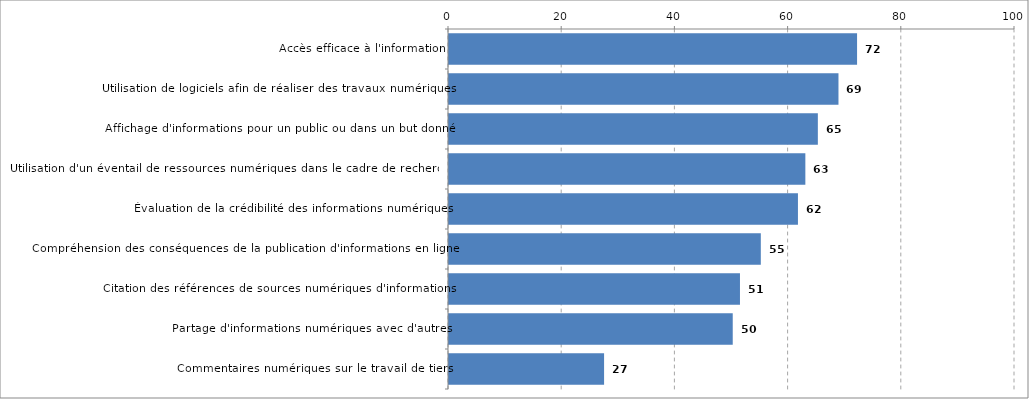
| Category | Series 0 |
|---|---|
| Accès efficace à l'information | 72.096 |
| Utilisation de logiciels afin de réaliser des travaux numériques | 68.812 |
| Affichage d'informations pour un public ou dans un but donné | 65.168 |
| Utilisation d'un éventail de ressources numériques dans le cadre de recherches | 62.96 |
| Évaluation de la crédibilité des informations numériques | 61.652 |
| Compréhension des conséquences de la publication d'informations en ligne | 55.091 |
| Citation des références de sources numériques d'informations | 51.408 |
| Partage d'informations numériques avec d'autres | 50.13 |
| Commentaires numériques sur le travail de tiers | 27.399 |